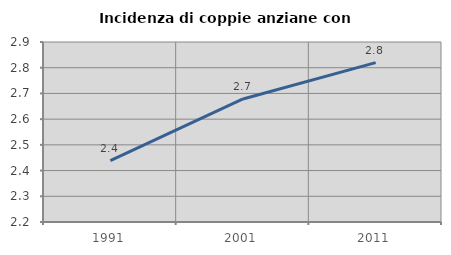
| Category | Incidenza di coppie anziane con figli |
|---|---|
| 1991.0 | 2.439 |
| 2001.0 | 2.679 |
| 2011.0 | 2.82 |